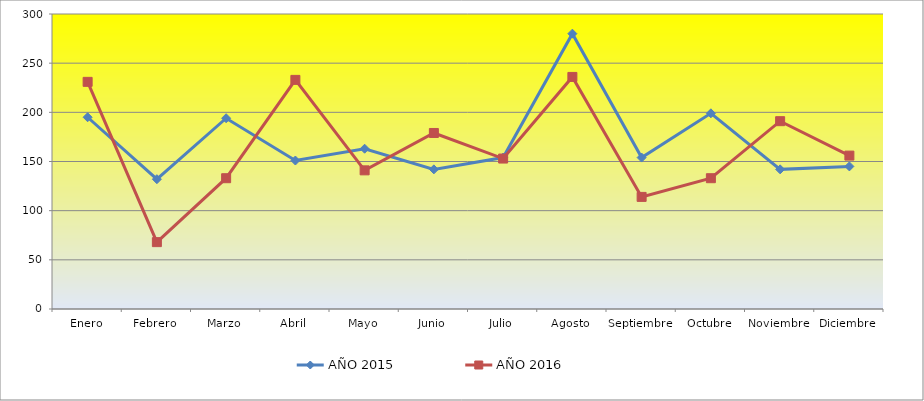
| Category | AÑO 2015 | AÑO 2016 |
|---|---|---|
| Enero | 195 | 231 |
| Febrero | 132 | 68 |
| Marzo | 194 | 133 |
| Abril | 151 | 233 |
| Mayo | 163 | 141 |
| Junio | 142 | 179 |
| Julio | 154 | 153 |
| Agosto | 280 | 236 |
| Septiembre | 154 | 114 |
| Octubre | 199 | 133 |
| Noviembre | 142 | 191 |
| Diciembre | 145 | 156 |